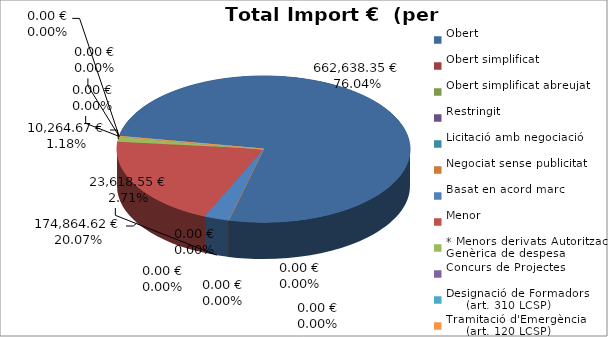
| Category | Total preu
(amb IVA) |
|---|---|
| Obert | 662638.35 |
| Obert simplificat | 0 |
| Obert simplificat abreujat | 0 |
| Restringit | 0 |
| Licitació amb negociació | 0 |
| Negociat sense publicitat | 0 |
| Basat en acord marc | 23618.55 |
| Menor | 174864.62 |
| * Menors derivats Autorització Genèrica de despesa | 10264.67 |
| Concurs de Projectes | 0 |
| Designació de Formadors
     (art. 310 LCSP) | 0 |
| Tramitació d'Emergència
     (art. 120 LCSP) | 0 |